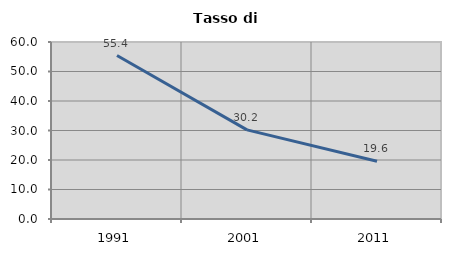
| Category | Tasso di disoccupazione   |
|---|---|
| 1991.0 | 55.404 |
| 2001.0 | 30.208 |
| 2011.0 | 19.594 |